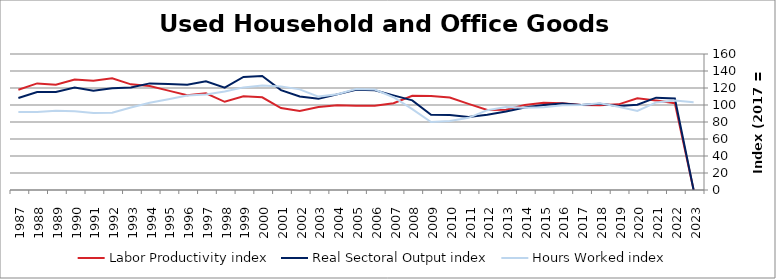
| Category | Labor Productivity index | Real Sectoral Output index | Hours Worked index |
|---|---|---|---|
| 2023.0 | 0 | 0 | 103.362 |
| 2022.0 | 102.132 | 107.579 | 105.333 |
| 2021.0 | 105.414 | 108.65 | 103.07 |
| 2020.0 | 107.857 | 100.299 | 92.993 |
| 2019.0 | 100.79 | 98.728 | 97.954 |
| 2018.0 | 99.576 | 101.481 | 101.914 |
| 2017.0 | 100 | 100 | 100 |
| 2016.0 | 102.056 | 101.799 | 99.748 |
| 2015.0 | 102.534 | 99.962 | 97.491 |
| 2014.0 | 100.132 | 97.001 | 96.872 |
| 2013.0 | 94.47 | 92.28 | 97.682 |
| 2012.0 | 94.248 | 88.495 | 93.895 |
| 2011.0 | 101.274 | 85.997 | 84.915 |
| 2010.0 | 108.712 | 88.129 | 81.066 |
| 2009.0 | 110.573 | 88.477 | 80.017 |
| 2008.0 | 110.807 | 105.416 | 95.135 |
| 2007.0 | 102.017 | 111.327 | 109.126 |
| 2006.0 | 99.199 | 117.28 | 118.226 |
| 2005.0 | 99.165 | 117.916 | 118.909 |
| 2004.0 | 99.786 | 112.472 | 112.713 |
| 2003.0 | 97.681 | 107.325 | 109.873 |
| 2002.0 | 92.862 | 109.944 | 118.395 |
| 2001.0 | 96.346 | 117.451 | 121.906 |
| 2000.0 | 109.063 | 134.211 | 123.058 |
| 1999.0 | 110.147 | 132.969 | 120.72 |
| 1998.0 | 103.78 | 120.345 | 115.962 |
| 1997.0 | 113.838 | 127.783 | 112.25 |
| 1996.0 | 111.554 | 123.867 | 111.038 |
| 1995.0 | 116.881 | 124.682 | 106.674 |
| 1994.0 | 122.284 | 125.435 | 102.576 |
| 1993.0 | 124.314 | 120.627 | 97.035 |
| 1992.0 | 131.558 | 119.737 | 91.015 |
| 1991.0 | 128.618 | 116.691 | 90.727 |
| 1990.0 | 129.882 | 120.433 | 92.725 |
| 1989.0 | 123.886 | 115.332 | 93.096 |
| 1988.0 | 125.411 | 115.171 | 91.835 |
| 1987.0 | 117.995 | 108.173 | 91.676 |